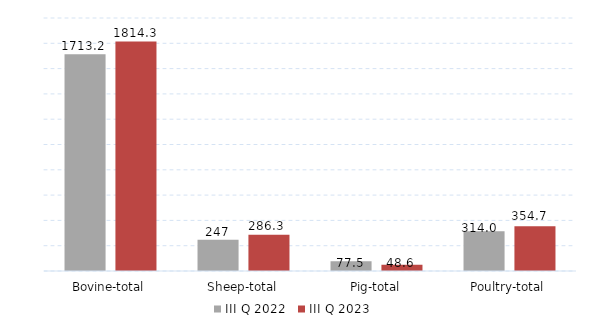
| Category | III Q 2022 | III Q 2023 |
|---|---|---|
| Bovine-total | 1713.2 | 1814.253 |
| Sheep-total | 247 | 286.3 |
| Pig-total | 77.5 | 48.6 |
| Poultry-total | 314 | 354.7 |